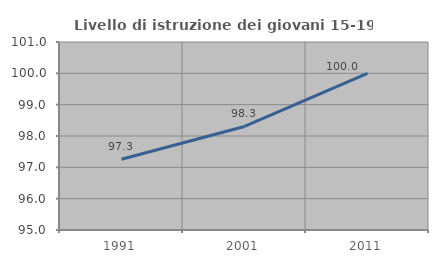
| Category | Livello di istruzione dei giovani 15-19 anni |
|---|---|
| 1991.0 | 97.26 |
| 2001.0 | 98.305 |
| 2011.0 | 100 |